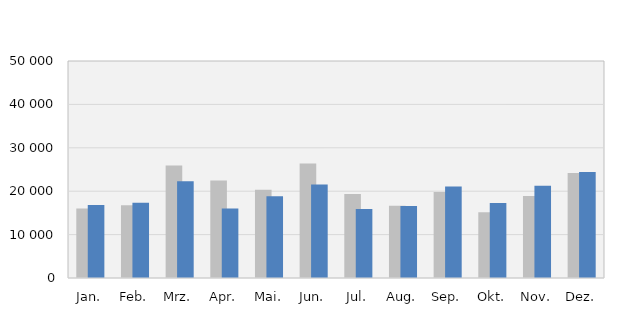
| Category | 2021 | 2022 |
|---|---|---|
| Jan. | 15993 | 16812 |
| Feb. | 16783 | 17363 |
| Mrz. | 25945 | 22291 |
| Apr. | 22440 | 16041 |
| Mai. | 20362 | 18846 |
| Jun. | 26386 | 21522 |
| Jul. | 19365 | 15879 |
| Aug. | 16622 | 16607 |
| Sep. | 19825 | 21089 |
| Okt. | 15168 | 17281 |
| Nov. | 18918 | 21273 |
| Dez. | 24215 | 24399 |